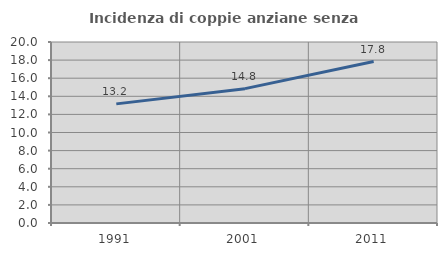
| Category | Incidenza di coppie anziane senza figli  |
|---|---|
| 1991.0 | 13.162 |
| 2001.0 | 14.847 |
| 2011.0 | 17.836 |